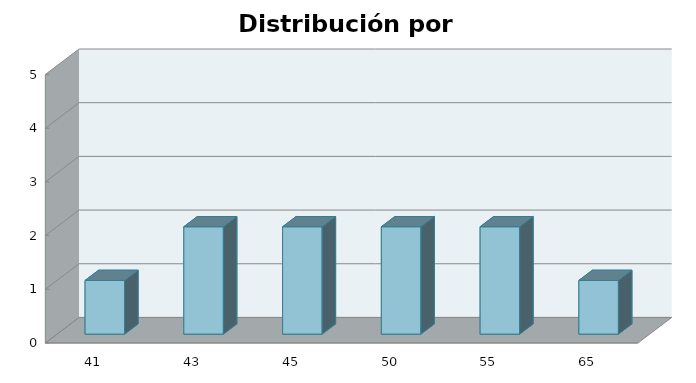
| Category | Series 1 |
|---|---|
| 41.0 | 1 |
| 43.0 | 2 |
| 45.0 | 2 |
| 50.0 | 2 |
| 55.0 | 2 |
| 65.0 | 1 |